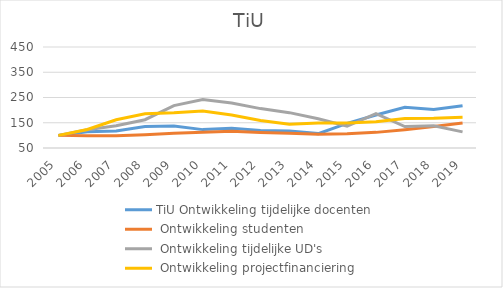
| Category | TiU |
|---|---|
| 2005.0 | 100 |
| 2006.0 | 123.185 |
| 2007.0 | 161.965 |
| 2008.0 | 185.827 |
| 2009.0 | 189.645 |
| 2010.0 | 196.124 |
| 2011.0 | 180.892 |
| 2012.0 | 159.14 |
| 2013.0 | 143.701 |
| 2014.0 | 148.983 |
| 2015.0 | 149.272 |
| 2016.0 | 154.27 |
| 2017.0 | 166.889 |
| 2018.0 | 168.084 |
| 2019.0 | 172.085 |